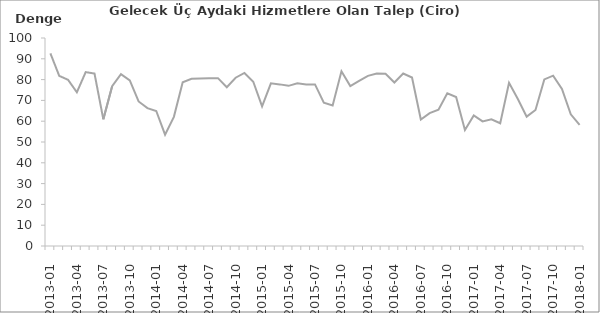
| Category | Denge  |
|---|---|
| 2013-01 | 92.6 |
|  | 81.8 |
|  | 79.9 |
| 2013-04 | 73.9 |
|  | 83.6 |
|  | 82.9 |
| 2013-07 | 60.9 |
|  | 76.8 |
|  | 82.6 |
| 2013-10 | 79.6 |
|  | 69.5 |
|  | 66.3 |
| 2014-01 | 64.9 |
|  | 53.5 |
|  | 62.1 |
| 2014-04 | 78.7 |
|  | 80.4 |
|  | 80.5 |
| 2014-07 | 80.6 |
|  | 80.7 |
|  | 76.3 |
| 2014-10 | 80.9 |
|  | 83.2 |
|  | 79 |
| 2015-01 | 67.1 |
|  | 78.2 |
|  | 77.7 |
| 2015-04 | 77 |
|  | 78.2 |
|  | 77.7 |
| 2015-07 | 77.7 |
|  | 68.9 |
|  | 67.6 |
| 2015-10 | 84 |
|  | 76.9 |
|  | 79.4 |
| 2016-01 | 81.8 |
|  | 82.9 |
|  | 82.8 |
| 2016-04 | 78.6 |
|  | 82.9 |
|  | 81 |
| 2016-07 | 60.8 |
|  | 63.9 |
|  | 65.5 |
| 2016-10 | 73.4 |
|  | 71.6 |
|  | 55.8 |
| 2017-01 | 62.8 |
|  | 59.9 |
|  | 60.9 |
| 2017-04 | 59 |
|  | 78.5 |
|  | 70.7 |
| 2017-07 | 62.2 |
|  | 65.4 |
|  | 80.1 |
| 2017-10 | 81.9 |
|  | 75.5 |
|  | 63.3 |
| 2018-01 | 58.2 |